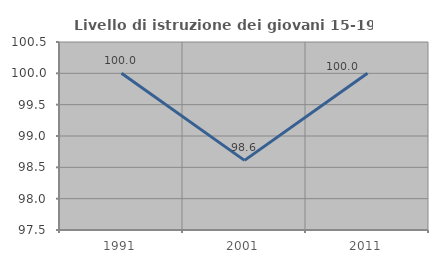
| Category | Livello di istruzione dei giovani 15-19 anni |
|---|---|
| 1991.0 | 100 |
| 2001.0 | 98.611 |
| 2011.0 | 100 |